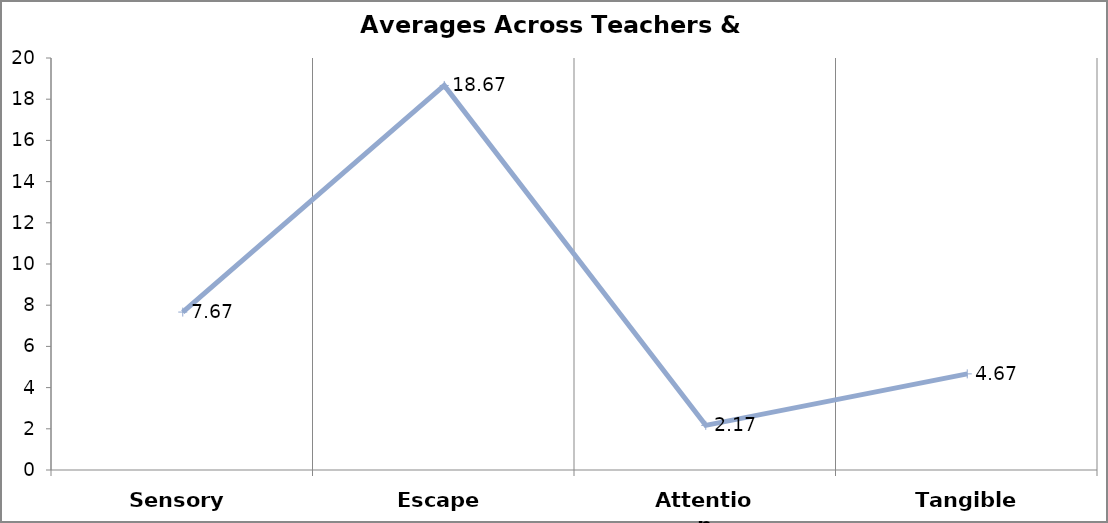
| Category | Averages |
|---|---|
| Sensory | 7.667 |
| Escape | 18.667 |
| Attention | 2.167 |
| Tangible | 4.667 |